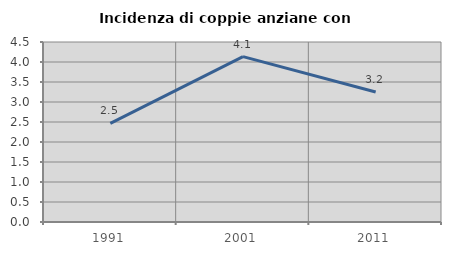
| Category | Incidenza di coppie anziane con figli |
|---|---|
| 1991.0 | 2.465 |
| 2001.0 | 4.135 |
| 2011.0 | 3.249 |